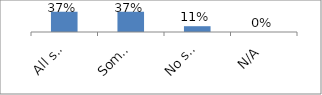
| Category | Series 0 |
|---|---|
| All sources of donor assistance are identified individually. | 0.368 |
| Some sources of donor assistance are identified individually. | 0.368 |
| No sources of donor assistance are identified individually. | 0.105 |
| N/A | 0 |